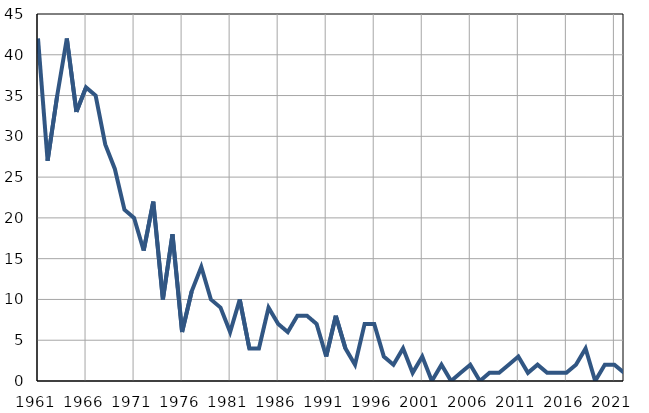
| Category | Infants
deaths |
|---|---|
| 1961.0 | 42 |
| 1962.0 | 27 |
| 1963.0 | 35 |
| 1964.0 | 42 |
| 1965.0 | 33 |
| 1966.0 | 36 |
| 1967.0 | 35 |
| 1968.0 | 29 |
| 1969.0 | 26 |
| 1970.0 | 21 |
| 1971.0 | 20 |
| 1972.0 | 16 |
| 1973.0 | 22 |
| 1974.0 | 10 |
| 1975.0 | 18 |
| 1976.0 | 6 |
| 1977.0 | 11 |
| 1978.0 | 14 |
| 1979.0 | 10 |
| 1980.0 | 9 |
| 1981.0 | 6 |
| 1982.0 | 10 |
| 1983.0 | 4 |
| 1984.0 | 4 |
| 1985.0 | 9 |
| 1986.0 | 7 |
| 1987.0 | 6 |
| 1988.0 | 8 |
| 1989.0 | 8 |
| 1990.0 | 7 |
| 1991.0 | 3 |
| 1992.0 | 8 |
| 1993.0 | 4 |
| 1994.0 | 2 |
| 1995.0 | 7 |
| 1996.0 | 7 |
| 1997.0 | 3 |
| 1998.0 | 2 |
| 1999.0 | 4 |
| 2000.0 | 1 |
| 2001.0 | 3 |
| 2002.0 | 0 |
| 2003.0 | 2 |
| 2004.0 | 0 |
| 2005.0 | 1 |
| 2006.0 | 2 |
| 2007.0 | 0 |
| 2008.0 | 1 |
| 2009.0 | 1 |
| 2010.0 | 2 |
| 2011.0 | 3 |
| 2012.0 | 1 |
| 2013.0 | 2 |
| 2014.0 | 1 |
| 2015.0 | 1 |
| 2016.0 | 1 |
| 2017.0 | 2 |
| 2018.0 | 4 |
| 2019.0 | 0 |
| 2020.0 | 2 |
| 2021.0 | 2 |
| 2022.0 | 1 |